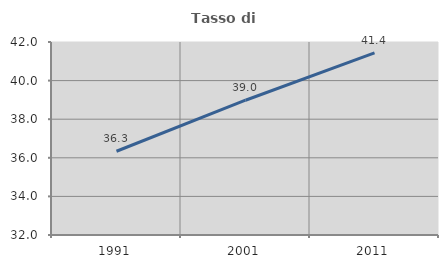
| Category | Tasso di occupazione   |
|---|---|
| 1991.0 | 36.339 |
| 2001.0 | 38.983 |
| 2011.0 | 41.44 |